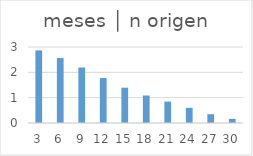
| Category | meses │ n origen |
|---|---|
| 3.0 | 2.866 |
| 6.0 | 2.563 |
| 9.0 | 2.188 |
| 12.0 | 1.774 |
| 15.0 | 1.394 |
| 18.0 | 1.086 |
| 21.0 | 0.845 |
| 24.0 | 0.599 |
| 27.0 | 0.347 |
| 30.0 | 0.162 |